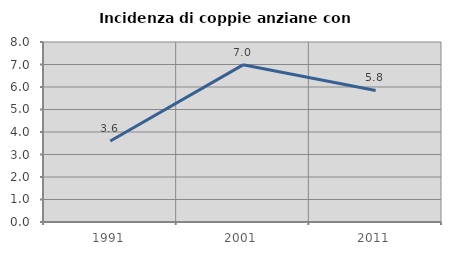
| Category | Incidenza di coppie anziane con figli |
|---|---|
| 1991.0 | 3.601 |
| 2001.0 | 6.985 |
| 2011.0 | 5.847 |